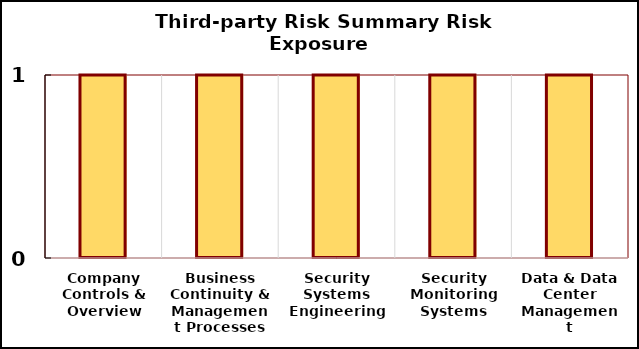
| Category | Third-Party Risk Summary |
|---|---|
| Company Controls & Overview | 1 |
| Business Continuity & Management Processes | 1 |
| Security Systems Engineering | 1 |
| Security Monitoring Systems | 1 |
| Data & Data Center Management | 1 |